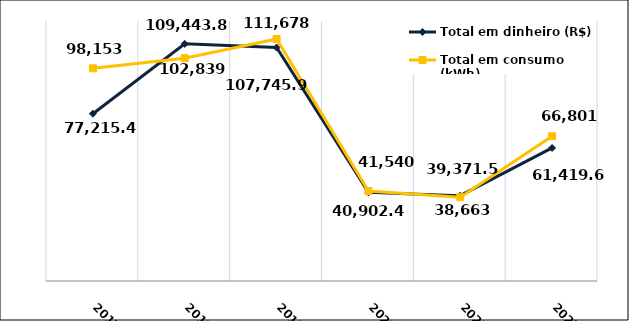
| Category | Total em dinheiro (R$) | Total em consumo (kWh) |
|---|---|---|
| 2017.0 | 77215.45 | 98153 |
| 2018.0 | 109443.87 | 102839 |
| 2019.0 | 107745.95 | 111678 |
| 2020.0 | 40902.47 | 41540 |
| 2021.0 | 39371.5 | 38663 |
| 2022.0 | 61419.63 | 66801 |